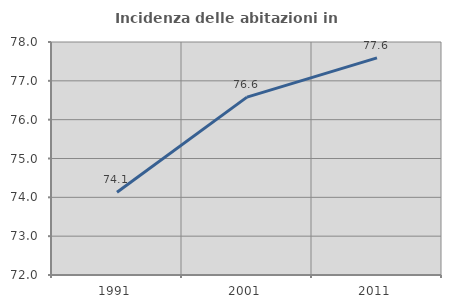
| Category | Incidenza delle abitazioni in proprietà  |
|---|---|
| 1991.0 | 74.133 |
| 2001.0 | 76.581 |
| 2011.0 | 77.593 |